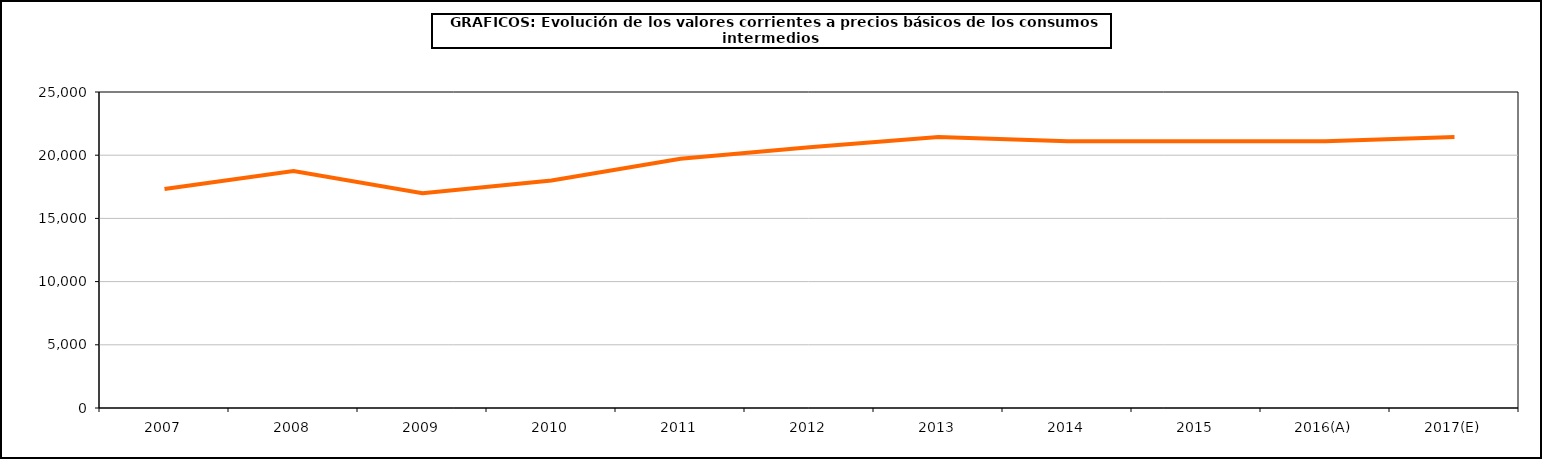
| Category | Total consumos intermedios |
|---|---|
| 2007 | 17320.3 |
| 2008 | 18741.8 |
| 2009 | 16992.3 |
| 2010 | 18005.1 |
| 2011 | 19714.8 |
| 2012 | 20625.1 |
| 2013 | 21445.2 |
| 2014 | 21097.4 |
| 2015 | 21104.1 |
| 2016(A) | 21097.9 |
| 2017(E) | 21437.7 |